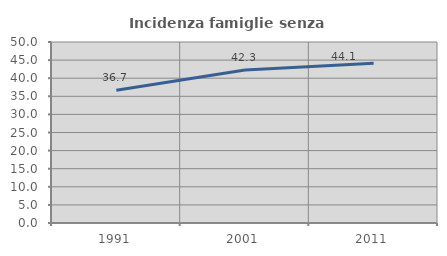
| Category | Incidenza famiglie senza nuclei |
|---|---|
| 1991.0 | 36.667 |
| 2001.0 | 42.259 |
| 2011.0 | 44.13 |